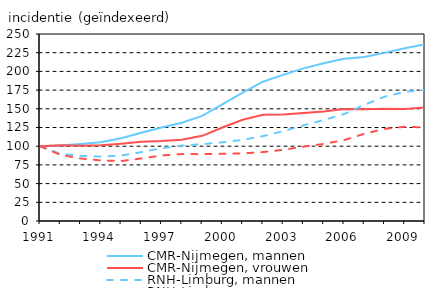
| Category | CMR-Nijmegen, mannen | CMR-Nijmegen, vrouwen | RNH-Limburg, mannen | RNH-Limburg, vrouwen |
|---|---|---|---|---|
| 1991.0 | 100 | 100 | 100 | 100 |
| 1992.0 | 100.873 | 101.274 | 89.841 | 88.407 |
| 1993.0 | 102.955 | 100.72 | 87.081 | 83.595 |
| 1994.0 | 105.178 | 101.314 | 86.096 | 80.987 |
| 1995.0 | 110.695 | 103.357 | 87.535 | 80.162 |
| 1996.0 | 118.049 | 105.966 | 92.068 | 83.622 |
| 1997.0 | 124.899 | 106.936 | 97.41 | 87.564 |
| 1998.0 | 131.319 | 108.765 | 100.738 | 89.496 |
| 1999.0 | 140.546 | 113.887 | 102.723 | 89.366 |
| 2000.0 | 155.876 | 124.998 | 105.189 | 89.786 |
| 2001.0 | 171.767 | 135.262 | 108.499 | 90.317 |
| 2002.0 | 186.203 | 142.066 | 113.432 | 92.163 |
| 2003.0 | 195.294 | 142.545 | 120.093 | 95.15 |
| 2004.0 | 204.054 | 144.222 | 127.922 | 99.413 |
| 2005.0 | 210.941 | 146.342 | 135.014 | 103.014 |
| 2006.0 | 216.955 | 149.639 | 142.878 | 108.119 |
| 2007.0 | 219.368 | 149.445 | 155.273 | 116.548 |
| 2008.0 | 224.755 | 149.968 | 166.032 | 123.116 |
| 2009.0 | 230.827 | 149.867 | 172.734 | 125.979 |
| 2010.0 | 236.372 | 151.913 | 174.978 | 125.089 |